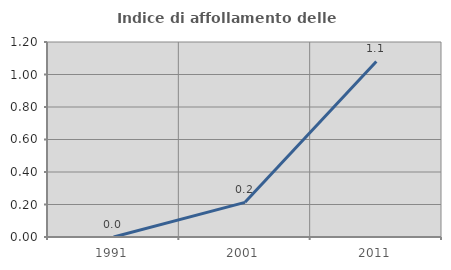
| Category | Indice di affollamento delle abitazioni  |
|---|---|
| 1991.0 | 0 |
| 2001.0 | 0.213 |
| 2011.0 | 1.08 |